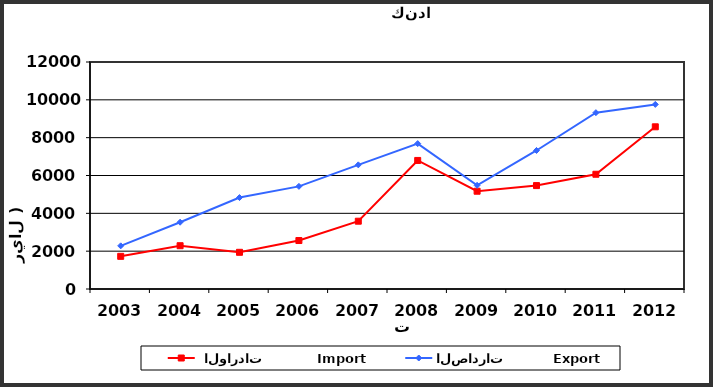
| Category |  الواردات           Import | الصادرات          Export |
|---|---|---|
| 2003.0 | 1727 | 2282 |
| 2004.0 | 2288 | 3531 |
| 2005.0 | 1940 | 4834 |
| 2006.0 | 2563 | 5426 |
| 2007.0 | 3584 | 6563 |
| 2008.0 | 6796 | 7686 |
| 2009.0 | 5169 | 5482 |
| 2010.0 | 5467 | 7323 |
| 2011.0 | 6066 | 9322 |
| 2012.0 | 8574 | 9758 |